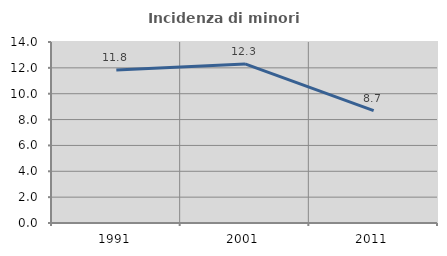
| Category | Incidenza di minori stranieri |
|---|---|
| 1991.0 | 11.842 |
| 2001.0 | 12.308 |
| 2011.0 | 8.696 |